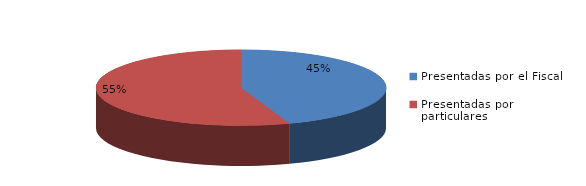
| Category | Series 0 |
|---|---|
| Presentadas por el Fiscal | 95 |
| Presentadas por particulares | 118 |